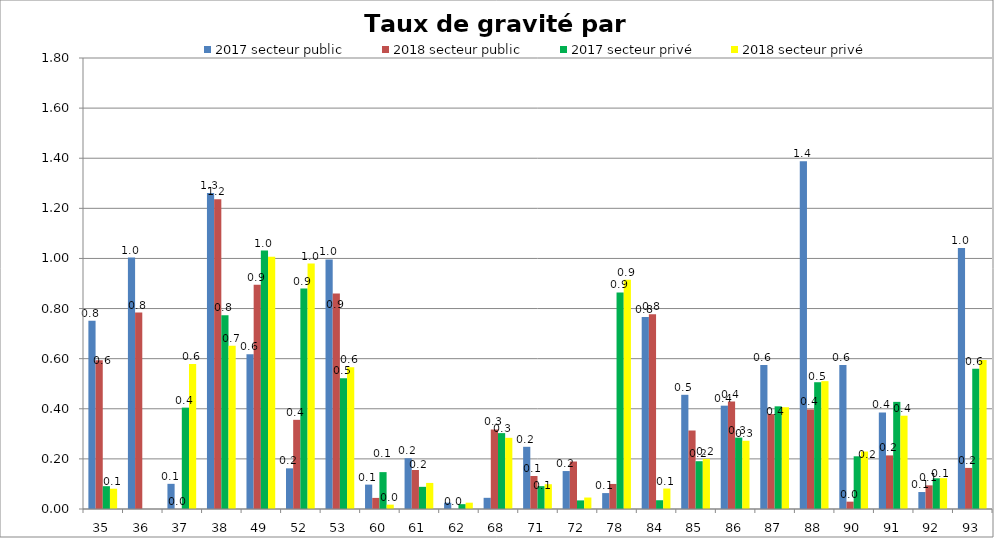
| Category | 2017 secteur public | 2018 secteur public | 2017 secteur privé | 2018 secteur privé |
|---|---|---|---|---|
| 35 | 0.751 | 0.594 | 0.091 | 0.081 |
| 36 | 1.003 | 0.784 | 0 | 0 |
| 37 | 0.1 | 0 | 0.405 | 0.579 |
| 38 | 1.261 | 1.236 | 0.773 | 0.652 |
| 49 | 0.618 | 0.895 | 1.031 | 1.007 |
| 52 | 0.162 | 0.356 | 0.88 | 0.979 |
| 53 | 0.996 | 0.86 | 0.522 | 0.566 |
| 60 | 0.097 | 0.044 | 0.147 | 0.017 |
| 61 | 0.203 | 0.156 | 0.088 | 0.104 |
| 62 | 0.025 | 0 | 0.019 | 0.025 |
| 68 | 0.045 | 0.317 | 0.303 | 0.284 |
| 71 | 0.248 | 0.132 | 0.091 | 0.099 |
| 72 | 0.151 | 0.189 | 0.034 | 0.046 |
| 78 | 0.064 | 0.1 | 0.865 | 0.915 |
| 84 | 0.767 | 0.777 | 0.035 | 0.082 |
| 85 | 0.456 | 0.313 | 0.191 | 0.2 |
| 86 | 0.412 | 0.429 | 0.285 | 0.272 |
| 87 | 0.574 | 0.379 | 0.41 | 0.406 |
| 88 | 1.388 | 0.397 | 0.506 | 0.51 |
| 90 | 0.575 | 0.029 | 0.21 | 0.229 |
| 91 | 0.386 | 0.214 | 0.428 | 0.372 |
| 92 | 0.068 | 0.094 | 0.123 | 0.123 |
| 93 | 1.042 | 0.164 | 0.56 | 0.595 |